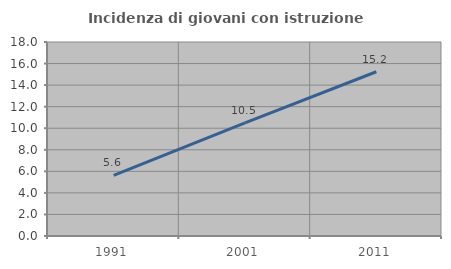
| Category | Incidenza di giovani con istruzione universitaria |
|---|---|
| 1991.0 | 5.622 |
| 2001.0 | 10.488 |
| 2011.0 | 15.24 |